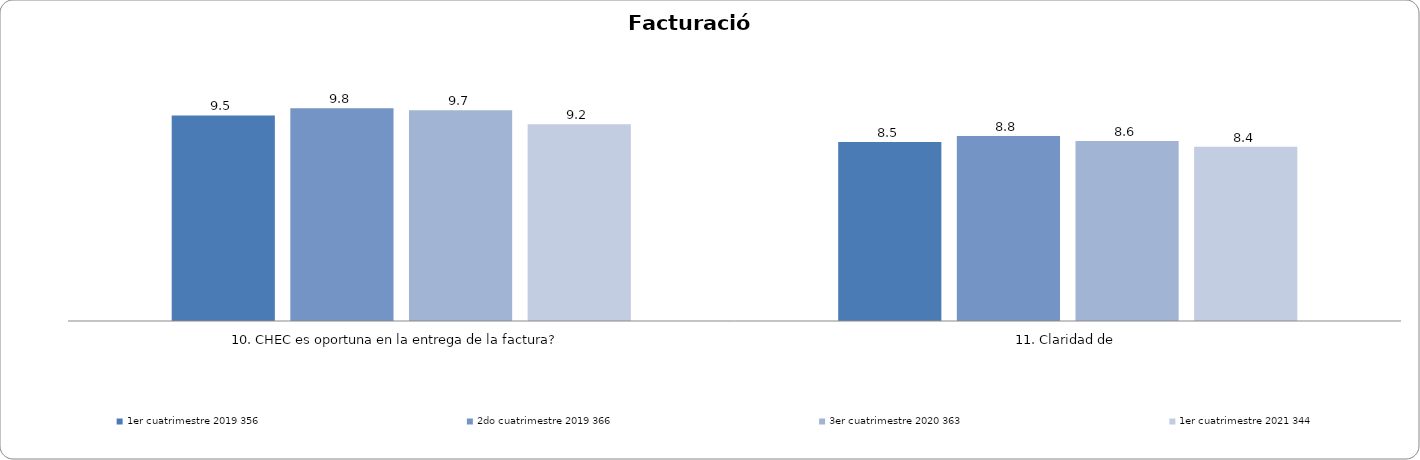
| Category | 1er cuatrimestre 2019 | 2do cuatrimestre 2019 | 3er cuatrimestre 2020 | 1er cuatrimestre 2021 |
|---|---|---|---|---|
| 10. CHEC es oportuna en la entrega de la factura? | 9.519 | 9.786 | 9.706 | 9.198 |
| 11. Claridad de | 8.547 | 8.772 | 8.589 | 8.374 |